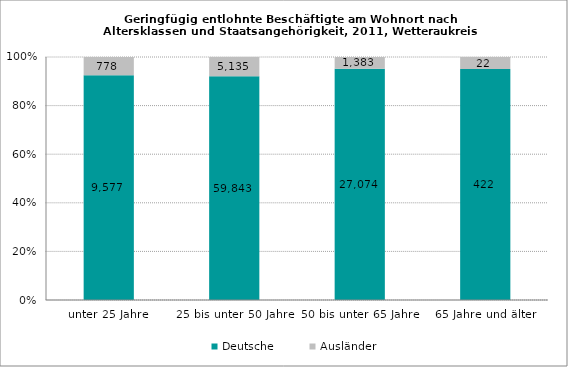
| Category | Deutsche | Ausländer |
|---|---|---|
| unter 25 Jahre | 9577 | 778 |
| 25 bis unter 50 Jahre | 59843 | 5135 |
| 50 bis unter 65 Jahre | 27074 | 1383 |
| 65 Jahre und älter | 422 | 22 |